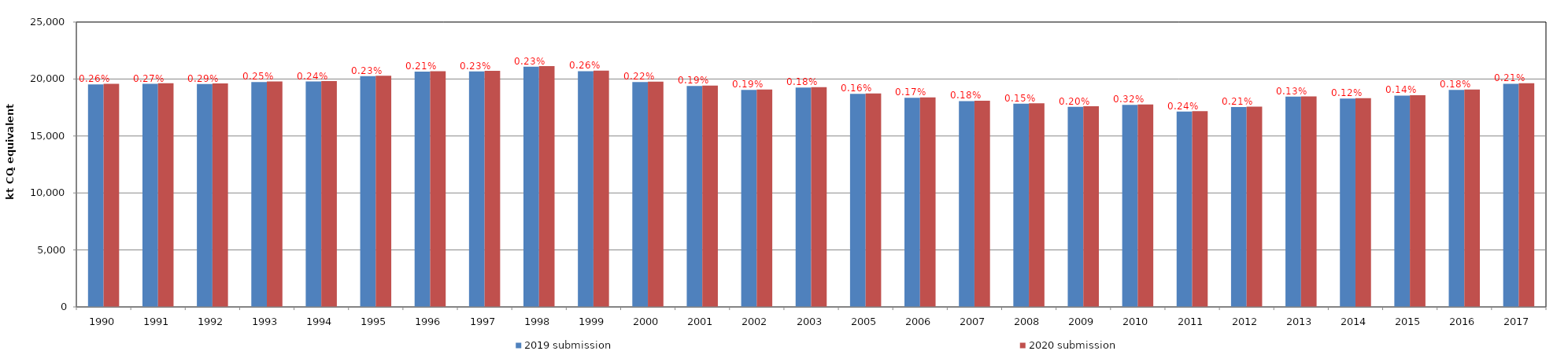
| Category | 2019 submission | 2020 submission |
|---|---|---|
| 1990.0 | 19533.827 | 19584.978 |
| 1991.0 | 19576.868 | 19629.625 |
| 1992.0 | 19555.053 | 19612.59 |
| 1993.0 | 19730.997 | 19779.408 |
| 1994.0 | 19780.871 | 19828.709 |
| 1995.0 | 20246.521 | 20292.814 |
| 1996.0 | 20642.527 | 20686.828 |
| 1997.0 | 20672.85 | 20719.403 |
| 1998.0 | 21077.73 | 21126.014 |
| 1999.0 | 20688.207 | 20741.885 |
| 2000.0 | 19734.476 | 19777.209 |
| 2001.0 | 19381.366 | 19418.423 |
| 2002.0 | 19046.326 | 19081.966 |
| 2003.0 | 19255.416 | 19290.728 |
| 2005.0 | 18699.33 | 18731.029 |
| 2006.0 | 18345.713 | 18379.267 |
| 2007.0 | 18062.371 | 18088.891 |
| 2008.0 | 17835.368 | 17871.713 |
| 2009.0 | 17560.747 | 17617.148 |
| 2010.0 | 17723.947 | 17765.618 |
| 2011.0 | 17140.759 | 17176.34 |
| 2012.0 | 17545.633 | 17568.039 |
| 2013.0 | 18454.705 | 18477.158 |
| 2014.0 | 18292.099 | 18318.423 |
| 2015.0 | 18548.065 | 18581.002 |
| 2016.0 | 19044.439 | 19084.677 |
| 2017.0 | 19581.401 | 19621.921 |